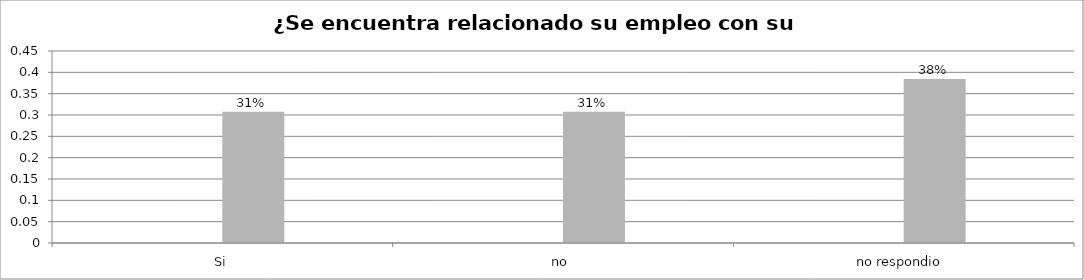
| Category | Series 0 | Series 1 | Series 2 | Series 3 |
|---|---|---|---|---|
| Si |  |  | 0.308 |  |
| no  |  |  | 0.308 |  |
| no respondio  |  |  | 0.385 |  |